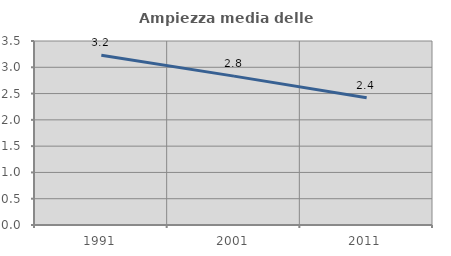
| Category | Ampiezza media delle famiglie |
|---|---|
| 1991.0 | 3.23 |
| 2001.0 | 2.832 |
| 2011.0 | 2.419 |